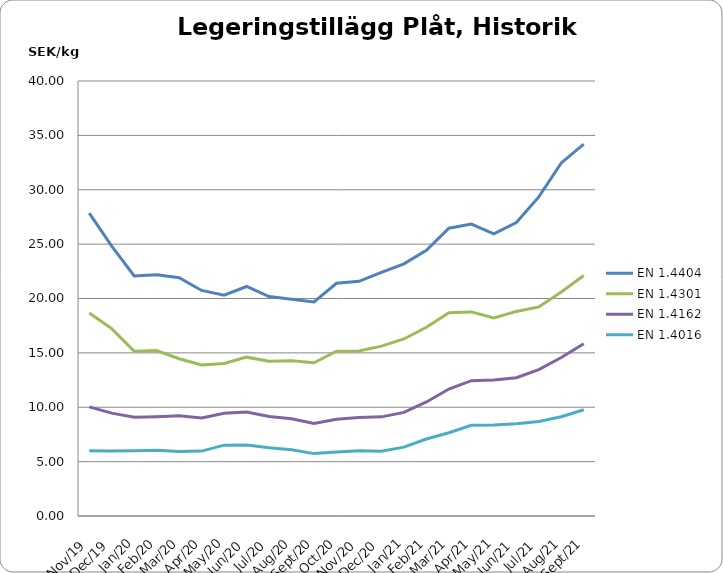
| Category | EN 1.4404 | EN 1.4301 | EN 1.4162  | EN 1.4016 |
|---|---|---|---|---|
| 2019-11-01 | 27.85 | 18.66 | 10.03 | 6.01 |
| 2019-12-01 | 24.82 | 17.23 | 9.46 | 5.97 |
| 2020-01-01 | 22.07 | 15.14 | 9.09 | 6 |
| 2020-02-01 | 22.19 | 15.21 | 9.13 | 6.05 |
| 2020-03-01 | 21.911 | 14.462 | 9.207 | 5.938 |
| 2020-04-01 | 20.74 | 13.88 | 9.02 | 5.97 |
| 2020-05-01 | 20.311 | 14.022 | 9.455 | 6.515 |
| 2020-06-01 | 21.105 | 14.607 | 9.554 | 6.524 |
| 2020-07-01 | 20.18 | 14.24 | 9.15 | 6.27 |
| 2020-08-01 | 19.932 | 14.286 | 8.939 | 6.099 |
| 2020-09-01 | 19.682 | 14.092 | 8.509 | 5.737 |
| 2020-10-01 | 21.4 | 15.147 | 8.892 | 5.888 |
| 2020-11-01 | 21.582 | 15.177 | 9.062 | 6.011 |
| 2020-12-01 | 22.402 | 15.617 | 9.115 | 5.945 |
| 2021-01-01 | 23.183 | 16.279 | 9.524 | 6.334 |
| 2021-02-01 | 24.425 | 17.354 | 10.488 | 7.077 |
| 2021-03-01 | 26.469 | 18.69 | 11.679 | 7.656 |
| 2021-04-01 | 26.842 | 18.766 | 12.443 | 8.336 |
| 2021-05-01 | 25.936 | 18.21 | 12.499 | 8.373 |
| 2021-06-01 | 26.983 | 18.811 | 12.71 | 8.473 |
| 2021-07-01 | 29.342 | 19.226 | 13.458 | 8.692 |
| 2021-08-01 | 32.47 | 20.6 | 14.57 | 9.13 |
| 2021-09-01 | 34.198 | 22.11 | 15.843 | 9.772 |